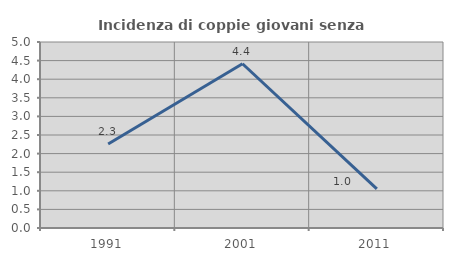
| Category | Incidenza di coppie giovani senza figli |
|---|---|
| 1991.0 | 2.26 |
| 2001.0 | 4.416 |
| 2011.0 | 1.05 |